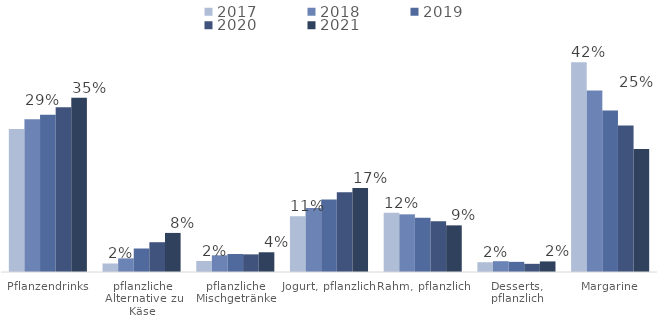
| Category | 2017 | 2018 | 2019 | 2020 | 2021 |
|---|---|---|---|---|---|
| Pflanzendrinks | 0.287 | 0.307 | 0.316 | 0.331 | 0.35 |
| pflanzliche Alternative zu Käse | 0.017 | 0.027 | 0.047 | 0.06 | 0.079 |
| pflanzliche Mischgetränke | 0.022 | 0.034 | 0.036 | 0.035 | 0.04 |
| Jogurt, pflanzlich | 0.112 | 0.129 | 0.146 | 0.16 | 0.169 |
| Rahm, pflanzlich | 0.119 | 0.116 | 0.109 | 0.102 | 0.094 |
| Desserts, pflanzlich | 0.02 | 0.022 | 0.02 | 0.016 | 0.021 |
| Margarine | 0.422 | 0.365 | 0.324 | 0.294 | 0.247 |